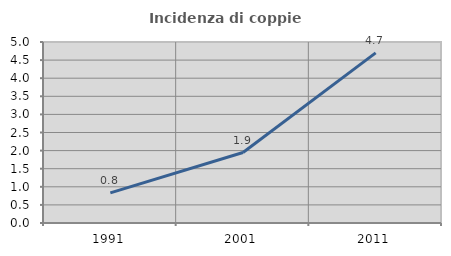
| Category | Incidenza di coppie miste |
|---|---|
| 1991.0 | 0.833 |
| 2001.0 | 1.946 |
| 2011.0 | 4.699 |